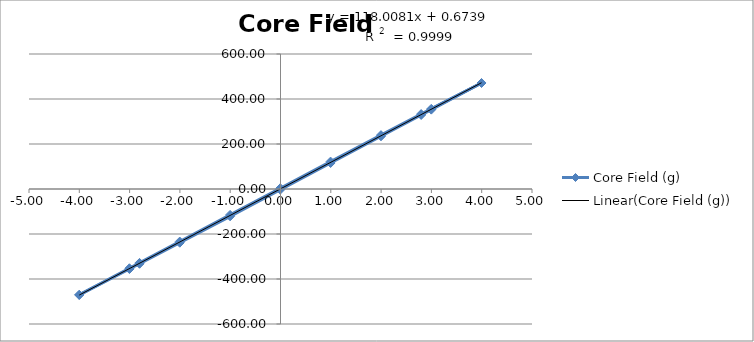
| Category | Core Field (g) |
|---|---|
| -4.00166 | -470.66 |
| -3.00344 | -355.72 |
| -2.8022599999999995 | -332.41 |
| -2.00257 | -238.79 |
| -1.00191 | -121.35 |
| -0.004200000000000001 | -2.82 |
| 0.99574 | 115.59 |
| 1.99747 | 234.25 |
| 2.79636 | 329.01 |
| 2.9978 | 352.75 |
| 3.9964899999999997 | 471.14 |
| 2.9978100000000003 | 356.24 |
| 2.7964 | 332.99 |
| 1.9975300000000002 | 239.43 |
| 0.9957499999999999 | 121.74 |
| -0.00426 | 3.52 |
| -1.0018 | -115.12 |
| -2.0025 | -233.56 |
| -2.80225 | -328.41 |
| -3.0033900000000004 | -352.27 |
| -4.0016099999999994 | -470.57 |